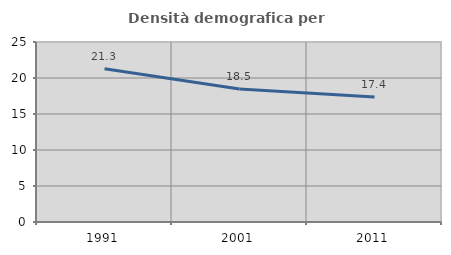
| Category | Densità demografica |
|---|---|
| 1991.0 | 21.285 |
| 2001.0 | 18.469 |
| 2011.0 | 17.372 |